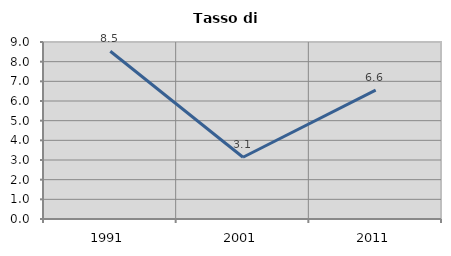
| Category | Tasso di disoccupazione   |
|---|---|
| 1991.0 | 8.531 |
| 2001.0 | 3.141 |
| 2011.0 | 6.553 |